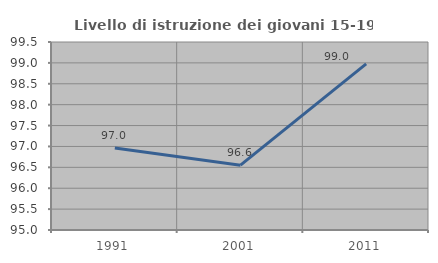
| Category | Livello di istruzione dei giovani 15-19 anni |
|---|---|
| 1991.0 | 96.964 |
| 2001.0 | 96.552 |
| 2011.0 | 98.977 |